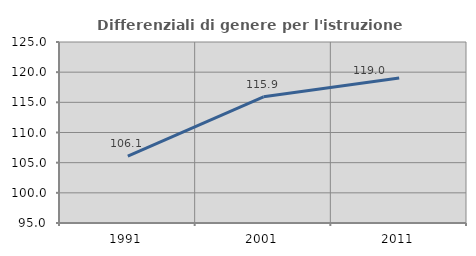
| Category | Differenziali di genere per l'istruzione superiore |
|---|---|
| 1991.0 | 106.09 |
| 2001.0 | 115.924 |
| 2011.0 | 119.034 |